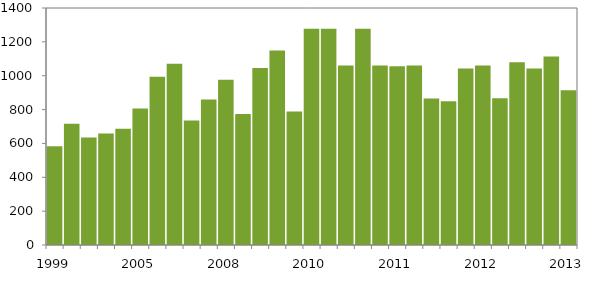
| Category | Weekly pay rates for lowest classification ($/week) |
|---|---|
| 1999.0 | 583.8 |
| 2002.0 | 715.92 |
| 2003.0 | 634.68 |
| 2005.0 | 659.3 |
| 2005.0 | 687.24 |
| 2005.0 | 806.76 |
| 2006.0 | 994.5 |
| 2006.0 | 1070.95 |
| 2008.0 | 735.3 |
| 2008.0 | 860.21 |
| 2008.0 | 976.13 |
| 2009.0 | 773.28 |
| 2009.0 | 1045 |
| 2010.0 | 1149.48 |
| 2010.0 | 788.4 |
| 2010.0 | 1277.75 |
| 2010.0 | 1277.75 |
| 2011.0 | 1060.92 |
| 2011.0 | 1277.75 |
| 2011.0 | 1060.92 |
| 2011.0 | 1055.75 |
| 2011.0 | 1060.92 |
| 2011.0 | 864.72 |
| 2011.0 | 849.24 |
| 2011.0 | 1042.55 |
| 2012.0 | 1060.92 |
| 2012.0 | 867.6 |
| 2012.0 | 1079.64 |
| 2012.0 | 1042.55 |
| 2012.0 | 1113.84 |
| 2013.0 | 914.4 |